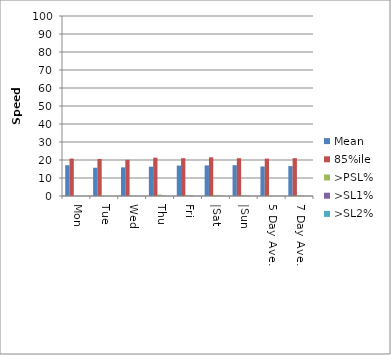
| Category | Mean | 85%ile | >PSL% | >SL1% | >SL2% |
|---|---|---|---|---|---|
| Mon | 17.1 | 20.8 | 0 | 0 | 0 |
| Tue | 15.7 | 20.6 | 0.2 | 0 | 0 |
| Wed | 15.9 | 20.1 | 0.2 | 0 | 0 |
| Thu | 16.3 | 21.3 | 0.8 | 0.2 | 0 |
| Fri | 16.9 | 21 | 0.6 | 0.2 | 0 |
| |Sat | 17 | 21.5 | 0.6 | 0.2 | 0 |
| |Sun | 17.1 | 21 | 0.6 | 0.2 | 0 |
| 5 Day Ave. | 16.4 | 20.8 | 0.324 | 0 | 0 |
| 7 Day Ave. | 16.6 | 21 | 0.4 | 0.1 | 0 |